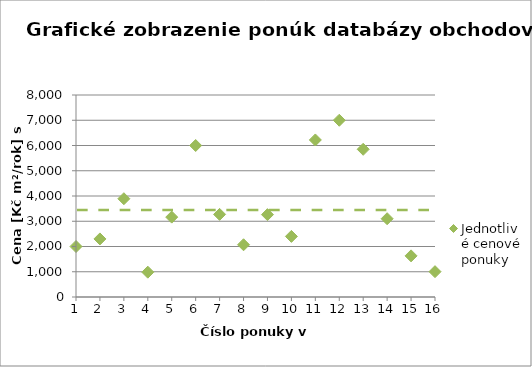
| Category | Jednotlivé cenové ponuky |
|---|---|
| 1.0 | 2000 |
| 2.0 | 2300 |
| 3.0 | 3891.892 |
| 4.0 | 982.801 |
| 5.0 | 3163.636 |
| 6.0 | 6000 |
| 7.0 | 3272.727 |
| 8.0 | 2068.966 |
| 9.0 | 3261.818 |
| 10.0 | 2400 |
| 11.0 | 6219.512 |
| 12.0 | 7000 |
| 13.0 | 5850 |
| 14.0 | 3100 |
| 15.0 | 1629 |
| 16.0 | 1003.361 |